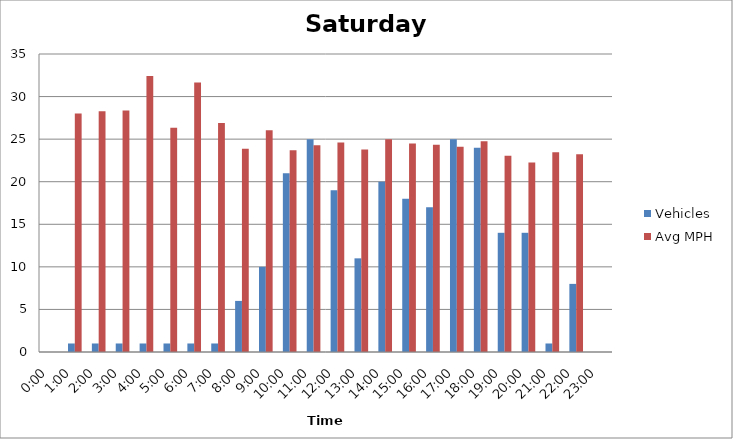
| Category | Vehicles | Avg MPH |
|---|---|---|
| 0:00 | 0 | 0 |
| 1:00 | 1 | 28 |
| 2:00 | 1 | 28.28 |
| 3:00 | 1 | 28.37 |
| 4:00 | 1 | 32.41 |
| 5:00 | 1 | 26.35 |
| 6:00 | 1 | 31.66 |
| 7:00 | 1 | 26.89 |
| 8:00 | 6 | 23.86 |
| 9:00 | 10 | 26.04 |
| 10:00 | 21 | 23.71 |
| 11:00 | 25 | 24.27 |
| 12:00 | 19 | 24.6 |
| 13:00 | 11 | 23.79 |
| 14:00 | 20 | 24.99 |
| 15:00 | 18 | 24.49 |
| 16:00 | 17 | 24.35 |
| 17:00 | 25 | 24.11 |
| 18:00 | 24 | 24.74 |
| 19:00 | 14 | 23.05 |
| 20:00 | 14 | 22.26 |
| 21:00 | 1 | 23.45 |
| 22:00 | 8 | 23.24 |
| 23:00 | 0 | 0 |